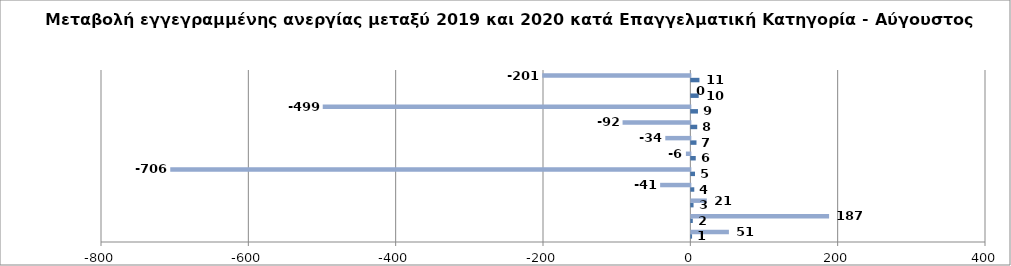
| Category | Series 0 | Series 1 |
|---|---|---|
| 0 | 1 | 51 |
| 1 | 2 | 187 |
| 2 | 3 | 21 |
| 3 | 4 | -41 |
| 4 | 5 | -706 |
| 5 | 6 | -6 |
| 6 | 7 | -34 |
| 7 | 8 | -92 |
| 8 | 9 | -499 |
| 9 | 10 | 0 |
| 10 | 11 | -201 |